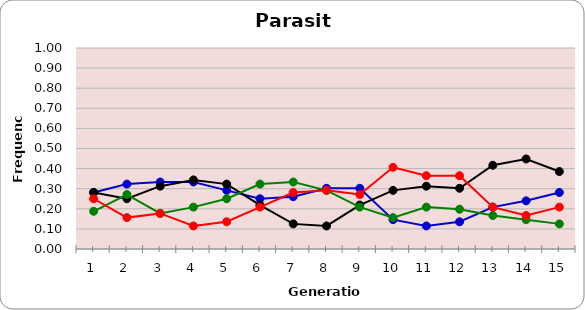
| Category | Sp | Cl | Di | He |
|---|---|---|---|---|
| 1.0 | 0.281 | 0.281 | 0.188 | 0.25 |
| 2.0 | 0.323 | 0.25 | 0.271 | 0.156 |
| 3.0 | 0.333 | 0.312 | 0.177 | 0.177 |
| 4.0 | 0.333 | 0.344 | 0.208 | 0.115 |
| 5.0 | 0.292 | 0.323 | 0.25 | 0.135 |
| 6.0 | 0.25 | 0.219 | 0.323 | 0.208 |
| 7.0 | 0.26 | 0.125 | 0.333 | 0.281 |
| 8.0 | 0.302 | 0.115 | 0.292 | 0.292 |
| 9.0 | 0.302 | 0.219 | 0.208 | 0.271 |
| 10.0 | 0.146 | 0.292 | 0.156 | 0.406 |
| 11.0 | 0.115 | 0.312 | 0.208 | 0.365 |
| 12.0 | 0.135 | 0.302 | 0.198 | 0.365 |
| 13.0 | 0.208 | 0.417 | 0.167 | 0.208 |
| 14.0 | 0.24 | 0.448 | 0.146 | 0.167 |
| 15.0 | 0.281 | 0.385 | 0.125 | 0.208 |